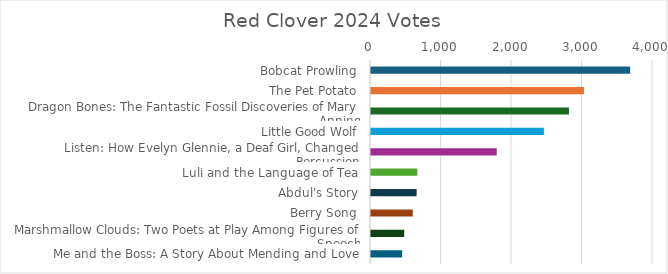
| Category | Votes |
|---|---|
| Bobcat Prowling | 3676 |
| The Pet Potato | 3021 |
| Dragon Bones: The Fantastic Fossil Discoveries of Mary Anning | 2808 |
| Little Good Wolf | 2452 |
| Listen: How Evelyn Glennie, a Deaf Girl, Changed Percussion | 1783 |
| Luli and the Language of Tea | 657 |
| Abdul's Story | 647 |
| Berry Song | 593 |
| Marshmallow Clouds: Two Poets at Play Among Figures of Speech | 471 |
| Me and the Boss: A Story About Mending and Love | 442 |